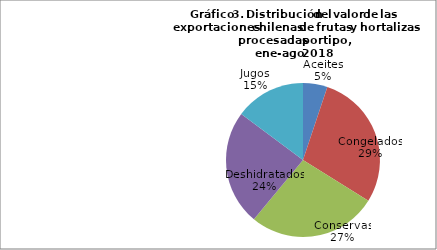
| Category | Series 0 |
|---|---|
| Aceites | 67951048.06 |
| Congelados | 381264304.56 |
| Conservas | 359693016.77 |
| Deshidratados | 320693384.65 |
| Jugos | 196491344.47 |